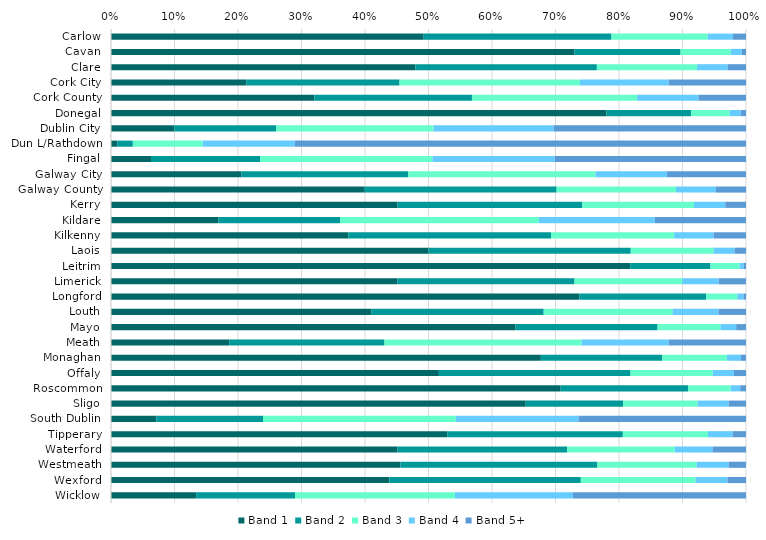
| Category | Band 1 | Band 2 | Band 3 | Band 4 | Band 5+ |
|---|---|---|---|---|---|
| Carlow | 0.492 | 0.296 | 0.152 | 0.04 | 0.021 |
| Cavan | 0.73 | 0.167 | 0.079 | 0.017 | 0.006 |
| Clare | 0.479 | 0.286 | 0.158 | 0.048 | 0.029 |
| Cork City | 0.213 | 0.241 | 0.284 | 0.14 | 0.122 |
| Cork County | 0.32 | 0.248 | 0.26 | 0.097 | 0.075 |
| Donegal | 0.78 | 0.133 | 0.061 | 0.017 | 0.008 |
| Dublin City | 0.1 | 0.161 | 0.248 | 0.189 | 0.303 |
| Dun L/Rathdown | 0.01 | 0.024 | 0.11 | 0.145 | 0.71 |
| Fingal | 0.063 | 0.172 | 0.271 | 0.193 | 0.301 |
| Galway City | 0.205 | 0.263 | 0.295 | 0.113 | 0.124 |
| Galway County | 0.4 | 0.302 | 0.188 | 0.063 | 0.048 |
| Kerry | 0.451 | 0.291 | 0.176 | 0.049 | 0.033 |
| Kildare | 0.169 | 0.192 | 0.313 | 0.183 | 0.143 |
| Kilkenny | 0.374 | 0.319 | 0.194 | 0.062 | 0.051 |
| Laois | 0.5 | 0.319 | 0.13 | 0.033 | 0.018 |
| Leitrim | 0.818 | 0.127 | 0.046 | 0.007 | 0.003 |
| Limerick | 0.451 | 0.279 | 0.17 | 0.057 | 0.043 |
| Longford | 0.738 | 0.2 | 0.049 | 0.01 | 0.004 |
| Louth | 0.41 | 0.272 | 0.203 | 0.073 | 0.043 |
| Mayo | 0.637 | 0.224 | 0.099 | 0.025 | 0.016 |
| Meath | 0.186 | 0.245 | 0.31 | 0.138 | 0.122 |
| Monaghan | 0.677 | 0.191 | 0.102 | 0.022 | 0.008 |
| Offaly | 0.516 | 0.302 | 0.13 | 0.033 | 0.019 |
| Roscommon | 0.708 | 0.201 | 0.067 | 0.015 | 0.009 |
| Sligo | 0.653 | 0.153 | 0.117 | 0.049 | 0.027 |
| South Dublin | 0.071 | 0.168 | 0.304 | 0.193 | 0.264 |
| Tipperary | 0.53 | 0.277 | 0.134 | 0.039 | 0.021 |
| Waterford | 0.451 | 0.267 | 0.169 | 0.06 | 0.053 |
| Westmeath | 0.456 | 0.31 | 0.156 | 0.051 | 0.027 |
| Wexford | 0.438 | 0.301 | 0.181 | 0.05 | 0.029 |
| Wicklow | 0.134 | 0.156 | 0.252 | 0.186 | 0.273 |